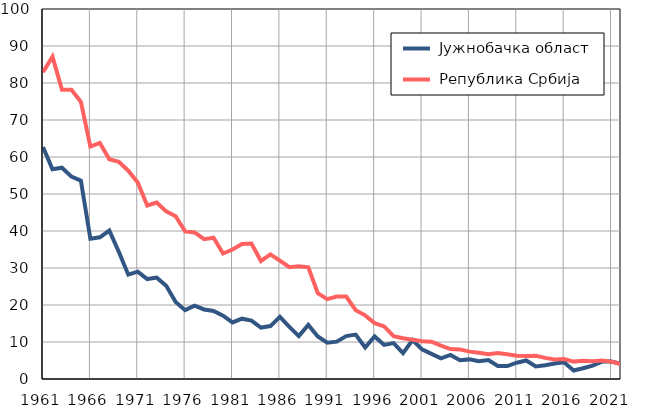
| Category |  Јужнобачка област |  Република Србија |
|---|---|---|
| 1961.0 | 62.7 | 82.9 |
| 1962.0 | 56.7 | 87.1 |
| 1963.0 | 57.1 | 78.2 |
| 1964.0 | 54.7 | 78.2 |
| 1965.0 | 53.6 | 74.9 |
| 1966.0 | 37.9 | 62.8 |
| 1967.0 | 38.3 | 63.8 |
| 1968.0 | 40.1 | 59.4 |
| 1969.0 | 34.4 | 58.7 |
| 1970.0 | 28.2 | 56.3 |
| 1971.0 | 29 | 53.1 |
| 1972.0 | 27 | 46.9 |
| 1973.0 | 27.4 | 47.7 |
| 1974.0 | 25.2 | 45.3 |
| 1975.0 | 20.8 | 44 |
| 1976.0 | 18.6 | 39.9 |
| 1977.0 | 19.8 | 39.6 |
| 1978.0 | 18.8 | 37.8 |
| 1979.0 | 18.4 | 38.2 |
| 1980.0 | 17.1 | 33.9 |
| 1981.0 | 15.3 | 35 |
| 1982.0 | 16.3 | 36.5 |
| 1983.0 | 15.8 | 36.6 |
| 1984.0 | 13.9 | 31.9 |
| 1985.0 | 14.3 | 33.7 |
| 1986.0 | 16.8 | 32 |
| 1987.0 | 14.1 | 30.2 |
| 1988.0 | 11.6 | 30.5 |
| 1989.0 | 14.6 | 30.2 |
| 1990.0 | 11.5 | 23.2 |
| 1991.0 | 9.8 | 21.6 |
| 1992.0 | 10.1 | 22.3 |
| 1993.0 | 11.6 | 22.3 |
| 1994.0 | 12 | 18.6 |
| 1995.0 | 8.5 | 17.2 |
| 1996.0 | 11.5 | 15.1 |
| 1997.0 | 9.2 | 14.2 |
| 1998.0 | 9.7 | 11.6 |
| 1999.0 | 7 | 11 |
| 2000.0 | 10.5 | 10.6 |
| 2001.0 | 8 | 10.2 |
| 2002.0 | 6.8 | 10.1 |
| 2003.0 | 5.6 | 9 |
| 2004.0 | 6.5 | 8.1 |
| 2005.0 | 5.1 | 8 |
| 2006.0 | 5.3 | 7.4 |
| 2007.0 | 4.8 | 7.1 |
| 2008.0 | 5.1 | 6.7 |
| 2009.0 | 3.5 | 7 |
| 2010.0 | 3.5 | 6.7 |
| 2011.0 | 4.4 | 6.3 |
| 2012.0 | 5 | 6.2 |
| 2013.0 | 3.4 | 6.3 |
| 2014.0 | 3.7 | 5.7 |
| 2015.0 | 4.2 | 5.3 |
| 2016.0 | 4.5 | 5.4 |
| 2017.0 | 2.3 | 4.7 |
| 2018.0 | 2.9 | 4.9 |
| 2019.0 | 3.6 | 4.8 |
| 2020.0 | 4.7 | 5 |
| 2021.0 | 4.7 | 4.7 |
| 2022.0 | 4.1 | 4 |